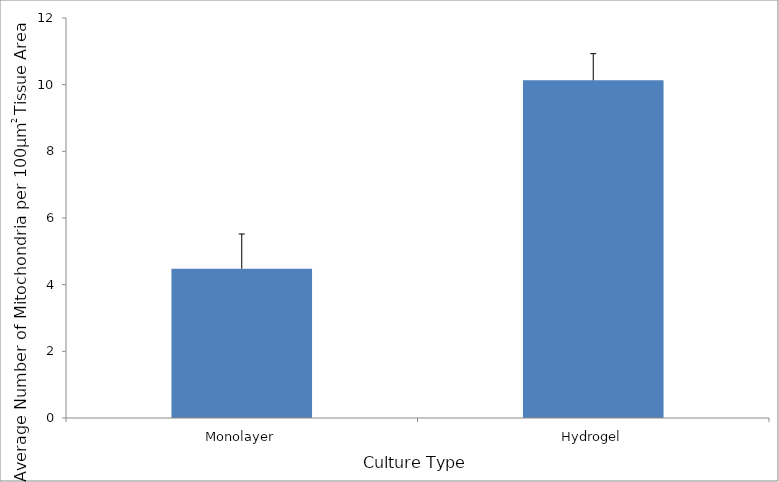
| Category | Average Number of Mitochondria per 100µm2 Tissue Area |
|---|---|
| Monolayer | 4.48 |
| Hydrogel | 10.13 |